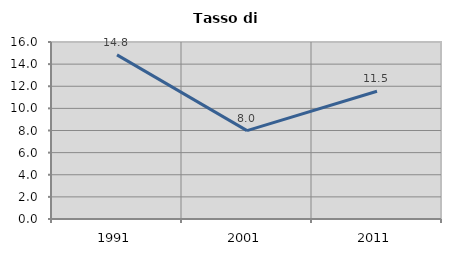
| Category | Tasso di disoccupazione   |
|---|---|
| 1991.0 | 14.832 |
| 2001.0 | 7.986 |
| 2011.0 | 11.547 |